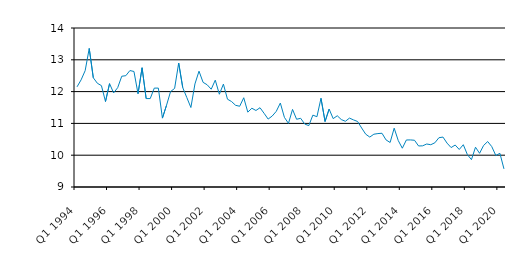
| Category | Series 0 |
|---|---|
| Q1 1994 | 12.15 |
| Q2 1994 | 12.369 |
| Q3 1994 | 12.659 |
| Q4 1994 | 13.357 |
| Q1 1995 | 12.435 |
| Q2 1995 | 12.262 |
| Q3 1995 | 12.188 |
| Q4 1995 | 11.688 |
| Q1 1996 | 12.25 |
| Q2 1996 | 11.958 |
| Q3 1996 | 12.125 |
| Q4 1996 | 12.483 |
| Q1 1997 | 12.5 |
| Q2 1997 | 12.662 |
| Q3 1997 | 12.633 |
| Q4 1997 | 11.933 |
| Q1 1998 | 12.75 |
| Q2 1998 | 11.781 |
| Q3 1998 | 11.781 |
| Q4 1998 | 12.11 |
| Q1 1999 | 12.11 |
| Q2 1999 | 11.166 |
| Q3 1999 | 11.566 |
| Q4 1999 | 12 |
| Q1 2000 | 12.1 |
| Q2 2000 | 12.899 |
| Q3 2000 | 12.125 |
| Q4 2000 | 11.812 |
| Q1 2001 | 11.5 |
| Q2 2001 | 12.241 |
| Q3 2001 | 12.642 |
| Q4 2001 | 12.291 |
| Q1 2002 | 12.215 |
| Q2 2002 | 12.075 |
| Q3 2002 | 12.36 |
| Q4 2002 | 11.917 |
| Q1 2003 | 12.236 |
| Q2 2003 | 11.761 |
| Q3 2003 | 11.688 |
| Q4 2003 | 11.569 |
| Q1 2004 | 11.539 |
| Q2 2004 | 11.807 |
| Q3 2004 | 11.354 |
| Q4 2004 | 11.477 |
| Q1 2005 | 11.406 |
| Q2 2005 | 11.493 |
| Q3 2005 | 11.318 |
| Q4 2005 | 11.136 |
| Q1 2006 | 11.231 |
| Q2 2006 | 11.38 |
| Q3 2006 | 11.64 |
| Q4 2006 | 11.19 |
| Q1 2007 | 11 |
| Q2 2007 | 11.44 |
| Q3 2007 | 11.13 |
| Q4 2007 | 11.16 |
| Q1 2008 | 10.98 |
| Q2 2008 | 10.93 |
| Q3 2008 | 11.26 |
| Q4 2008 | 11.21 |
| Q1 2009 | 11.79 |
| Q2 2009 | 11.06 |
| Q3 2009 | 11.45 |
| Q4 2009 | 11.15 |
| Q1 2010 | 11.24 |
| Q2 2010 | 11.12 |
| Q3 2010 | 11.067 |
| Q4 2010 | 11.166 |
| Q1 2011 | 11.11 |
| Q2 2011 | 11.06 |
| Q3 2011 | 10.855 |
| Q4 2011 | 10.66 |
| Q1 2012 | 10.57 |
| Q2 2012 | 10.66 |
| Q3 2012 | 10.68 |
| Q4 2012 | 10.69 |
| Q1 2013 | 10.48 |
| Q2 2013 | 10.4 |
| Q3 2013 | 10.85 |
| Q4 2013 | 10.46 |
| Q1 2014 | 10.22 |
| Q2 2014 | 10.479 |
| Q3 2014 | 10.48 |
| Q4 2014 | 10.47 |
| Q1 2015 | 10.29 |
| Q2 2015 | 10.295 |
| Q3 2015 | 10.352 |
| Q4 2015 | 10.33 |
| Q1 2016 | 10.39 |
| Q2 2016 | 10.55 |
| Q3 2016 | 10.57 |
| Q4 2016 | 10.38 |
| Q1 2017 | 10.24 |
| Q2 2017 | 10.32 |
| Q3 2017 | 10.18 |
| Q4 2017 | 10.33 |
| Q1 2018 | 10.02 |
| Q2 2018 | 9.86 |
| Q3 2018 | 10.251 |
| Q4 2018 | 10.06 |
| Q1 2019 | 10.308 |
| Q2 2019 | 10.429 |
| Q3 2019 | 10.27 |
| Q4 2019* | 9.99 |
| Q1 2020 | 10.06 |
| Q2 2021 | 9.57 |